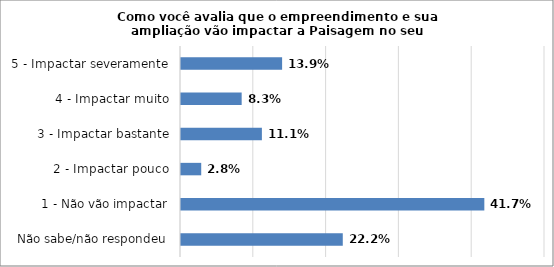
| Category | Series 0 |
|---|---|
| Não sabe/não respondeu | 0.222 |
| 1 - Não vão impactar | 0.417 |
| 2 - Impactar pouco | 0.028 |
| 3 - Impactar bastante | 0.111 |
| 4 - Impactar muito | 0.083 |
| 5 - Impactar severamente | 0.139 |